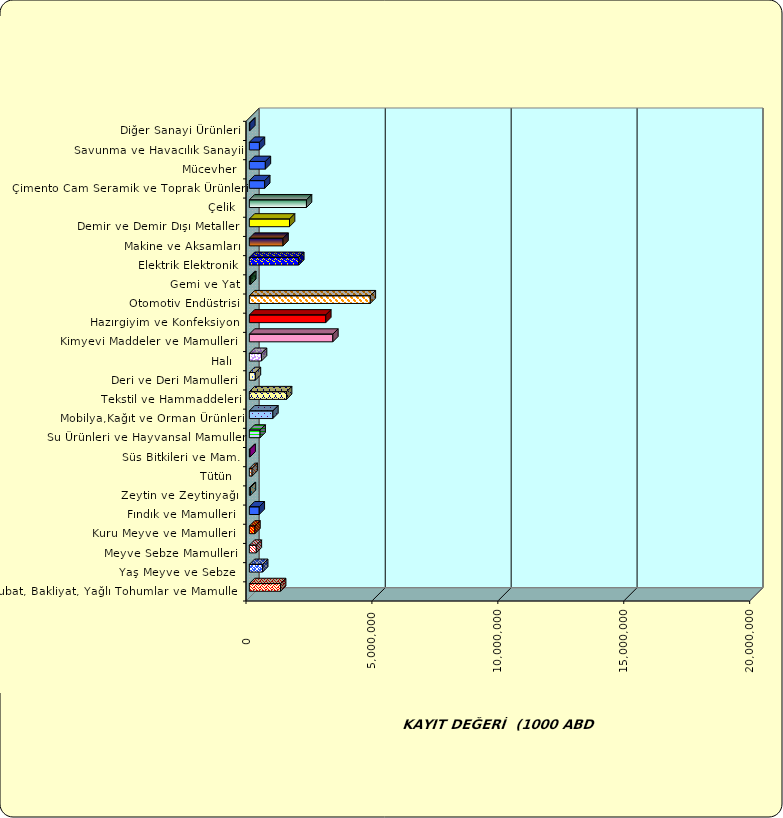
| Category | Series 0 |
|---|---|
|  Hububat, Bakliyat, Yağlı Tohumlar ve Mamulleri  | 1240615.139 |
|  Yaş Meyve ve Sebze   | 528448.723 |
|  Meyve Sebze Mamulleri  | 275876.673 |
|  Kuru Meyve ve Mamulleri   | 220997.587 |
|  Fındık ve Mamulleri  | 393032.671 |
|  Zeytin ve Zeytinyağı  | 42140.275 |
|  Tütün  | 108317.692 |
|  Süs Bitkileri ve Mam. | 28334.368 |
|  Su Ürünleri ve Hayvansal Mamuller | 426471.117 |
|  Mobilya,Kağıt ve Orman Ürünleri | 933504.714 |
|  Tekstil ve Hammaddeleri | 1477129.194 |
|  Deri ve Deri Mamulleri  | 239528.904 |
|  Halı  | 482756.968 |
|  Kimyevi Maddeler ve Mamulleri   | 3315133.837 |
|  Hazırgiyim ve Konfeksiyon  | 3035476.755 |
|  Otomotiv Endüstrisi | 4802764.005 |
|  Gemi ve Yat | 57221.677 |
|  Elektrik Elektronik | 1962108.671 |
|  Makine ve Aksamları | 1337785.014 |
|  Demir ve Demir Dışı Metaller  | 1595351.46 |
|  Çelik | 2268385.382 |
|  Çimento Cam Seramik ve Toprak Ürünleri | 609554.275 |
|  Mücevher | 635642.839 |
|  Savunma ve Havacılık Sanayii | 400222.03 |
|  Diğer Sanayi Ürünleri | 17942.324 |